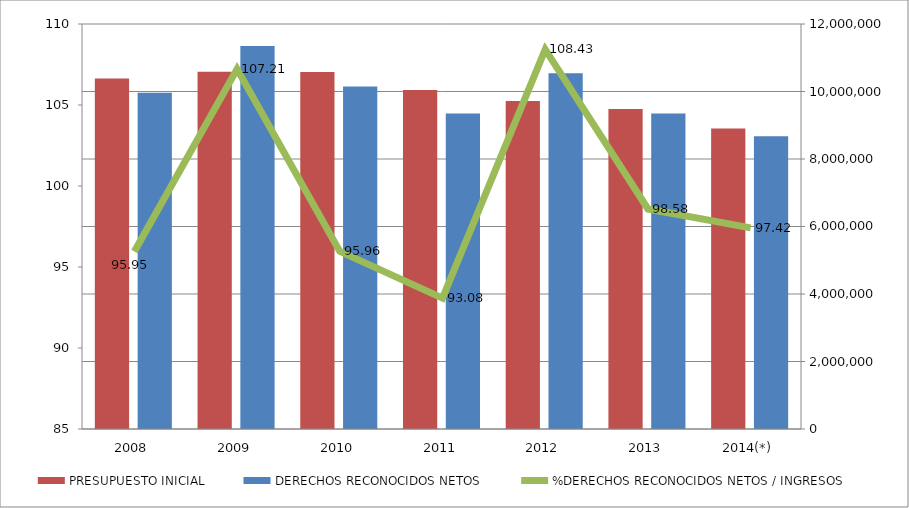
| Category | PRESUPUESTO INICIAL | DERECHOS RECONOCIDOS NETOS |
|---|---|---|
| 2008 | 10384241.1 | 9963830.94 |
| 2009 | 10584541.7 | 11348207.61 |
| 2010 | 10575537.04 | 10148708.38 |
| 2011 | 10045146.21 | 9349535.33 |
| 2012 | 9720048.42 | 10539361.95 |
| 2013 | 9481615.09 | 9347167.21 |
| 2014(*) | 8905196.683 | 8675187.58 |